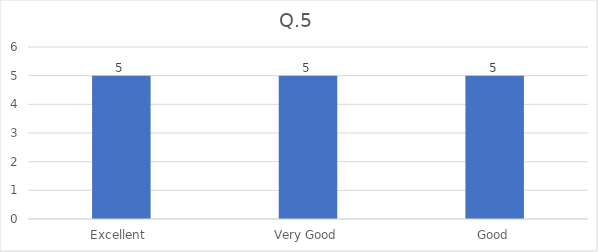
| Category | Series 0 |
|---|---|
| Excellent  | 5 |
| Very Good | 5 |
| Good | 5 |